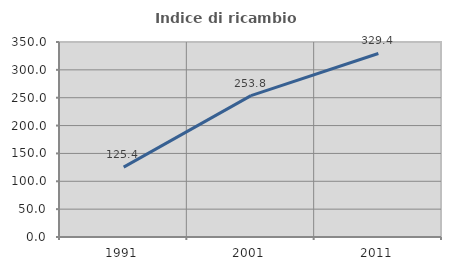
| Category | Indice di ricambio occupazionale  |
|---|---|
| 1991.0 | 125.397 |
| 2001.0 | 253.846 |
| 2011.0 | 329.412 |